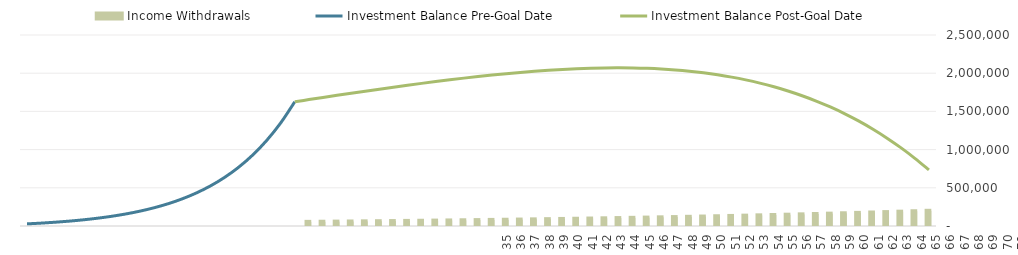
| Category |  Income Withdrawals |
|---|---|
| 0 | 0 |
| 1 | 0 |
| 2 | 0 |
| 3 | 0 |
| 4 | 0 |
| 5 | 0 |
| 6 | 0 |
| 7 | 0 |
| 8 | 0 |
| 9 | 0 |
| 10 | 0 |
| 11 | 0 |
| 12 | 0 |
| 13 | 0 |
| 14 | 0 |
| 15 | 0 |
| 16 | 0 |
| 17 | 0 |
| 18 | 0 |
| 19 | 0 |
| 20 | 54183.337 |
| 21 | 55808.837 |
| 22 | 57483.102 |
| 23 | 59207.595 |
| 24 | 60983.823 |
| 25 | 62813.338 |
| 26 | 64697.738 |
| 27 | 66638.67 |
| 28 | 68637.83 |
| 29 | 70696.965 |
| 30 | 72817.874 |
| 31 | 75002.41 |
| 32 | 77252.483 |
| 33 | 79570.057 |
| 34 | 81957.159 |
| 35 | 84415.874 |
| 36 | 86948.35 |
| 37 | 89556.8 |
| 38 | 92243.504 |
| 39 | 95010.809 |
| 40 | 97861.134 |
| 41 | 100796.968 |
| 42 | 103820.877 |
| 43 | 106935.503 |
| 44 | 110143.568 |
| 45 | 113447.875 |
| 46 | 116851.312 |
| 47 | 120356.851 |
| 48 | 123967.556 |
| 49 | 127686.583 |
| 50 | 131517.181 |
| 51 | 135462.696 |
| 52 | 139526.577 |
| 53 | 143712.374 |
| 54 | 148023.745 |
| 55 | 152464.458 |
| 56 | 157038.391 |
| 57 | 161749.543 |
| 58 | 166602.03 |
| 59 | 171600.09 |
| 60 | 176748.093 |
| 61 | 182050.536 |
| 62 | 187512.052 |
| 63 | 193137.414 |
| 64 | 198931.536 |